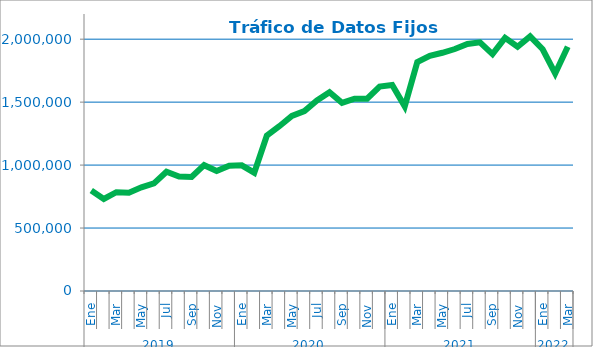
| Category | Series 2 |
|---|---|
| 0 | 798685.918 |
| 1 | 731575.817 |
| 2 | 784749.128 |
| 3 | 780968.133 |
| 4 | 823287.283 |
| 5 | 854090.708 |
| 6 | 947593.778 |
| 7 | 909855.298 |
| 8 | 906240.596 |
| 9 | 999396.547 |
| 10 | 952644.18 |
| 11 | 994702.802 |
| 12 | 998043.119 |
| 13 | 939529.747 |
| 14 | 1233422.945 |
| 15 | 1308700.517 |
| 16 | 1390818.383 |
| 17 | 1429389.058 |
| 18 | 1513898.129 |
| 19 | 1578469.308 |
| 20 | 1494651.805 |
| 21 | 1527689.762 |
| 22 | 1527595.376 |
| 23 | 1624013.076 |
| 24 | 1635978.542 |
| 25 | 1466373.79 |
| 26 | 1817279.963 |
| 27 | 1867095.32 |
| 28 | 1892209.579 |
| 29 | 1921759.576 |
| 30 | 1962438.137 |
| 31 | 1975182.781 |
| 32 | 1881672.102 |
| 33 | 2010730.589 |
| 34 | 1940295.941 |
| 35 | 2022499.807 |
| 36 | 1919833.376 |
| 37 | 1727728.602 |
| 38 | 1940004.078 |